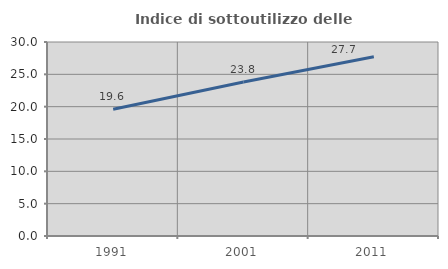
| Category | Indice di sottoutilizzo delle abitazioni  |
|---|---|
| 1991.0 | 19.609 |
| 2001.0 | 23.824 |
| 2011.0 | 27.724 |